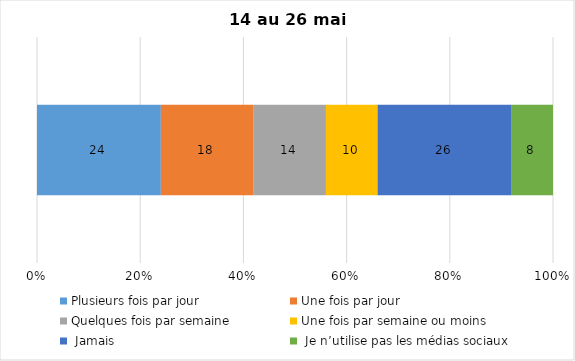
| Category | Plusieurs fois par jour | Une fois par jour | Quelques fois par semaine   | Une fois par semaine ou moins   |  Jamais   |  Je n’utilise pas les médias sociaux |
|---|---|---|---|---|---|---|
| 0 | 24 | 18 | 14 | 10 | 26 | 8 |